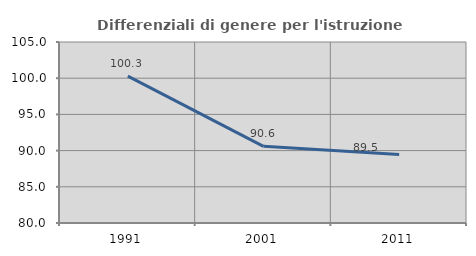
| Category | Differenziali di genere per l'istruzione superiore |
|---|---|
| 1991.0 | 100.29 |
| 2001.0 | 90.588 |
| 2011.0 | 89.47 |